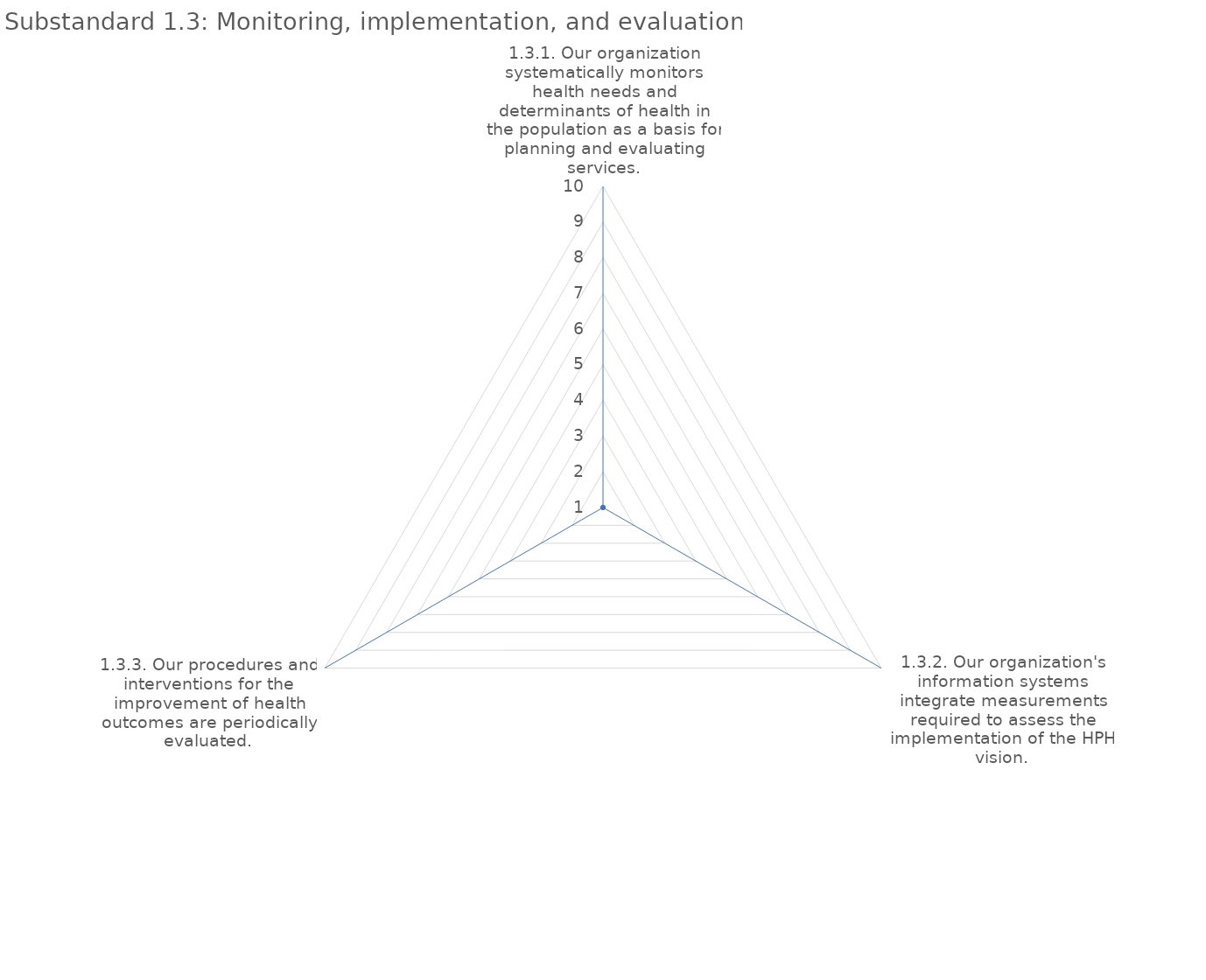
| Category | value |
|---|---|
| 1.3.1. Our organization systematically monitors health needs and determinants of health in the population as a basis for planning and evaluating services. | 1 |
| 1.3.2. Our organization's information systems integrate measurements required to assess the implementation of the HPH vision. | 1 |
| 1.3.3. Our procedures and interventions for the improvement of health outcomes are periodically evaluated. | 1 |